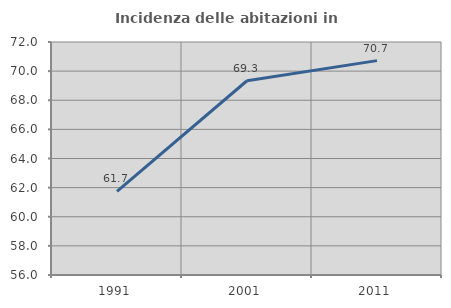
| Category | Incidenza delle abitazioni in proprietà  |
|---|---|
| 1991.0 | 61.747 |
| 2001.0 | 69.34 |
| 2011.0 | 70.722 |